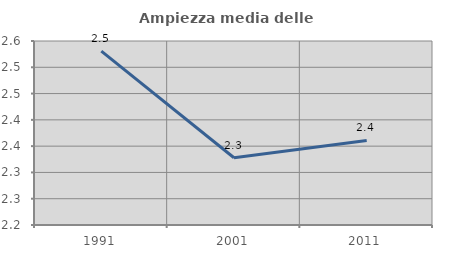
| Category | Ampiezza media delle famiglie |
|---|---|
| 1991.0 | 2.531 |
| 2001.0 | 2.328 |
| 2011.0 | 2.361 |